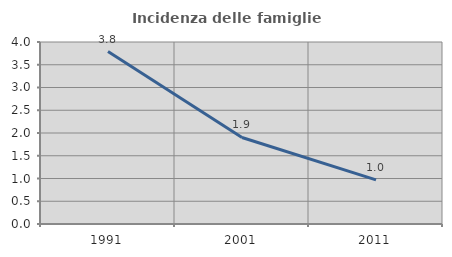
| Category | Incidenza delle famiglie numerose |
|---|---|
| 1991.0 | 3.789 |
| 2001.0 | 1.902 |
| 2011.0 | 0.971 |